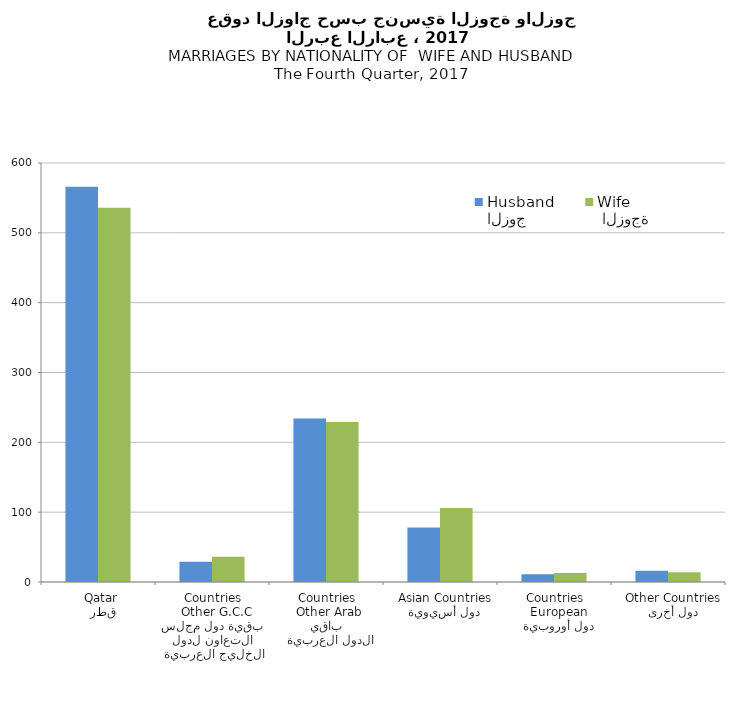
| Category | الزوج
Husband |  الزوجة
Wife |
|---|---|---|
|   قطر
 Qatar | 566 | 536 |
|  بقية دول مجلس التعاون لدول الخليج العربية
  Other G.C.C Countries | 29 | 36 |
|   باقي الدول العربية
 Other Arab Countries | 234 | 229 |
|   دول أسيوية
  Asian Countries | 78 | 106 |
|   دول أوروبية
  European Countries | 11 | 13 |
|   دول أخرى
  Other Countries | 16 | 14 |